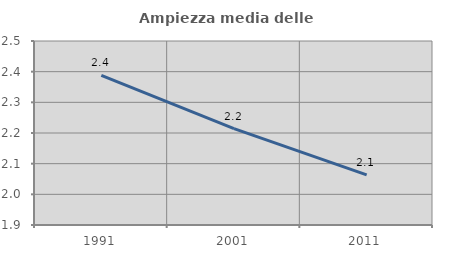
| Category | Ampiezza media delle famiglie |
|---|---|
| 1991.0 | 2.388 |
| 2001.0 | 2.214 |
| 2011.0 | 2.063 |